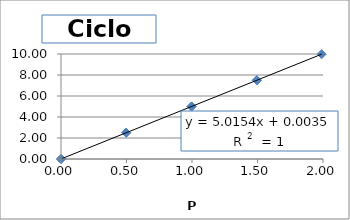
| Category | Output (V) |
|---|---|
| 0.0 | 0 |
| 0.49760000000000004 | 2.503 |
| 0.9968 | 4.999 |
| 1.495 | 7.5 |
| 1.9898000000000002 | 9.985 |
| 1.495 | 7.5 |
| 0.9968 | 5.004 |
| 0.49760000000000004 | 2.502 |
| 0.0 | 0.004 |